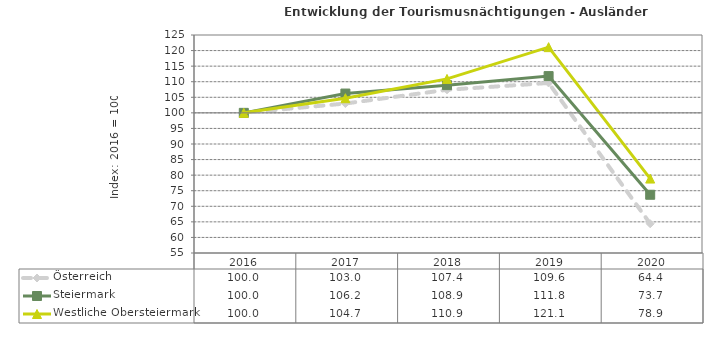
| Category | Österreich | Steiermark | Westliche Obersteiermark |
|---|---|---|---|
| 2020.0 | 64.4 | 73.7 | 78.9 |
| 2019.0 | 109.6 | 111.8 | 121.1 |
| 2018.0 | 107.4 | 108.9 | 110.9 |
| 2017.0 | 103 | 106.2 | 104.7 |
| 2016.0 | 100 | 100 | 100 |